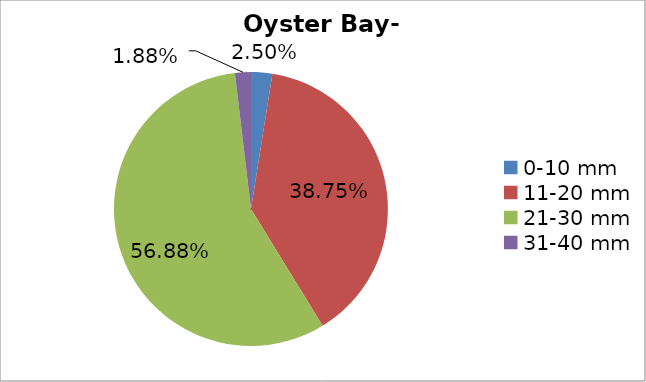
| Category | Series 0 |
|---|---|
| 0-10 mm | 0.025 |
| 11-20 mm | 0.388 |
| 21-30 mm | 0.569 |
| 31-40 mm | 0.019 |